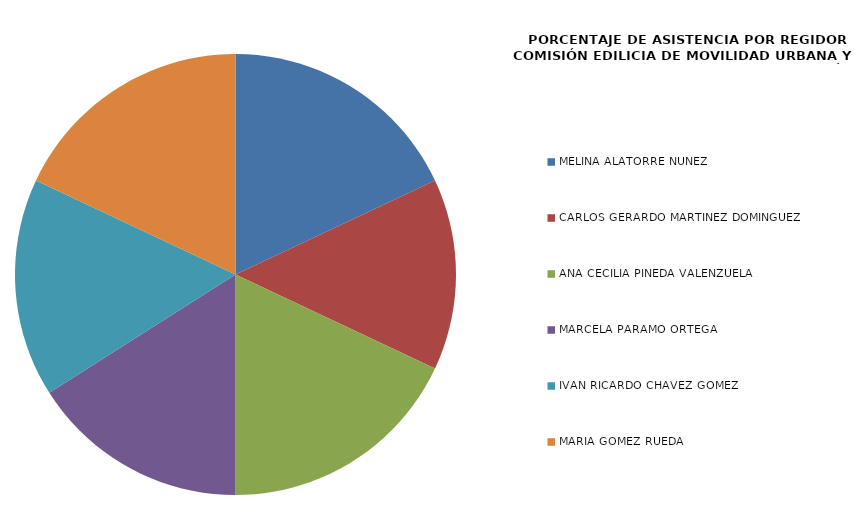
| Category | Series 0 |
|---|---|
| MELINA ALATORRE NÚÑEZ | 100 |
| CARLOS GERARDO MARTÍNEZ DOMÍNGUEZ | 77.778 |
| ANA CECILIA PINEDA VALENZUELA | 100 |
| MARCELA PARÁMO ORTEGA | 88.889 |
| IVÁN RICARDO CHÁVEZ GÓMEZ | 88.889 |
| MARÍA GÓMEZ RUEDA | 100 |